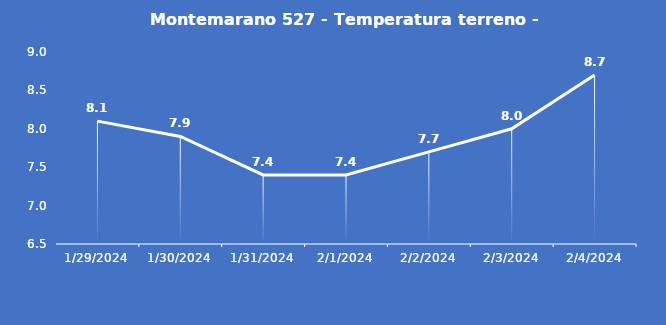
| Category | Montemarano 527 - Temperatura terreno - Grezzo (°C) |
|---|---|
| 1/29/24 | 8.1 |
| 1/30/24 | 7.9 |
| 1/31/24 | 7.4 |
| 2/1/24 | 7.4 |
| 2/2/24 | 7.7 |
| 2/3/24 | 8 |
| 2/4/24 | 8.7 |